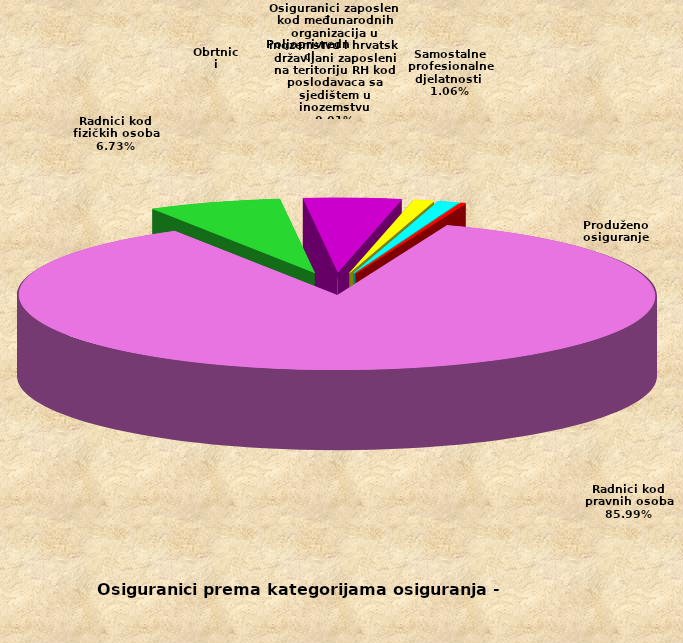
| Category | Series 0 |
|---|---|
| Radnici kod pravnih osoba | 1480284 |
| Radnici kod fizičkih osoba | 115814 |
| Obrtnici | 84902 |
| Poljoprivrednici | 18065 |
| Samostalne profesionalne djelatnosti  | 18300 |
| Osiguranici zaposleni kod međunarodnih organizacija u inozemstvu i hrvatski državljani zaposleni na teritoriju RH kod poslodavaca sa sjedištem u inozemstvu | 189 |
| Produženo osiguranje | 3972 |